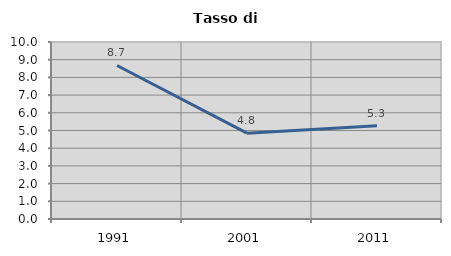
| Category | Tasso di disoccupazione   |
|---|---|
| 1991.0 | 8.673 |
| 2001.0 | 4.85 |
| 2011.0 | 5.274 |